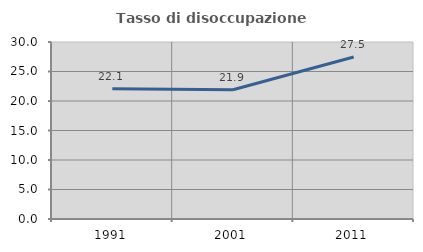
| Category | Tasso di disoccupazione giovanile  |
|---|---|
| 1991.0 | 22.078 |
| 2001.0 | 21.918 |
| 2011.0 | 27.451 |